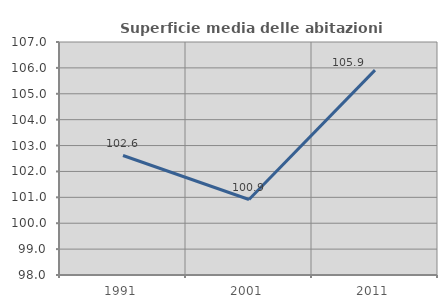
| Category | Superficie media delle abitazioni occupate |
|---|---|
| 1991.0 | 102.614 |
| 2001.0 | 100.915 |
| 2011.0 | 105.914 |